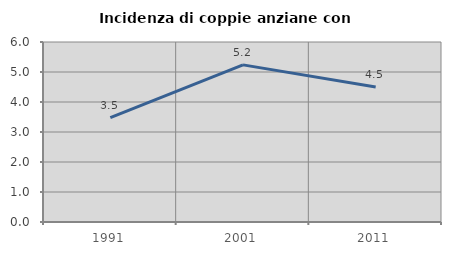
| Category | Incidenza di coppie anziane con figli |
|---|---|
| 1991.0 | 3.478 |
| 2001.0 | 5.238 |
| 2011.0 | 4.503 |